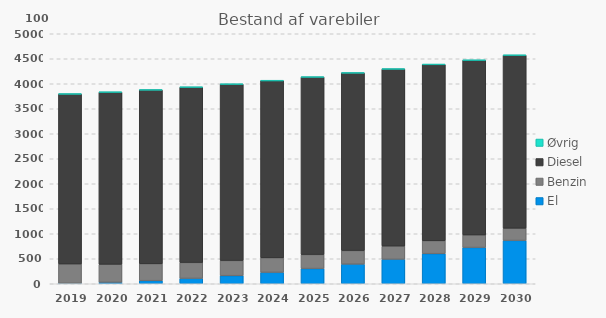
| Category | El | Benzin | Diesel | Øvrig |
|---|---|---|---|---|
| 2019 | 9 | 387 | 3399 | 1 |
| 2020 | 30 | 360 | 3441 | 2 |
| 2021 | 62 | 337 | 3477 | 2 |
| 2022 | 107 | 318 | 3506 | 2 |
| 2023 | 162 | 303 | 3526 | 2 |
| 2024 | 228 | 290 | 3543 | 2 |
| 2025 | 304 | 280 | 3549 | 3 |
| 2026 | 392 | 272 | 3552 | 3 |
| 2027 | 490 | 264 | 3540 | 3 |
| 2028 | 602 | 258 | 3525 | 3 |
| 2029 | 725 | 252 | 3493 | 3 |
| 2030 | 866 | 246 | 3458 | 3 |